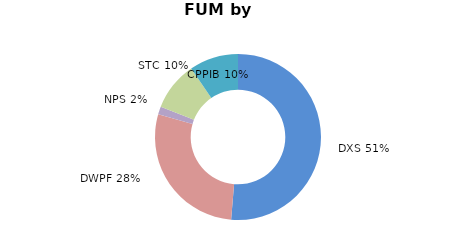
| Category | Series 0 |
|---|---|
| DXS | 0.512 |
| DWPF | 0.281 |
| NPS | 0.015 |
| STC | 0.095 |
| CPPIB | 0.095 |